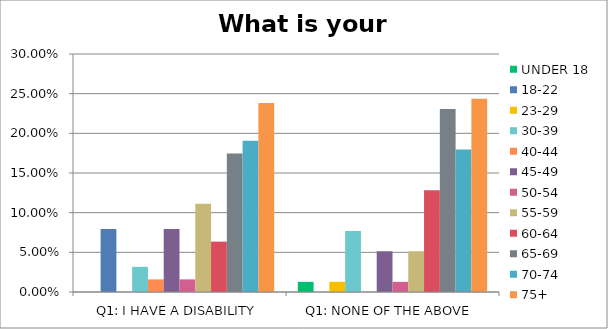
| Category | UNDER 18 | 18-22 | 23-29 | 30-39 | 40-44 | 45-49 | 50-54 | 55-59 | 60-64 | 65-69 | 70-74 | 75+ |
|---|---|---|---|---|---|---|---|---|---|---|---|---|
| Q1: I HAVE A DISABILITY | 0 | 0.079 | 0 | 0.032 | 0.016 | 0.079 | 0.016 | 0.111 | 0.064 | 0.175 | 0.19 | 0.238 |
| Q1: NONE OF THE ABOVE | 0.013 | 0 | 0.013 | 0.077 | 0 | 0.051 | 0.013 | 0.051 | 0.128 | 0.231 | 0.18 | 0.244 |